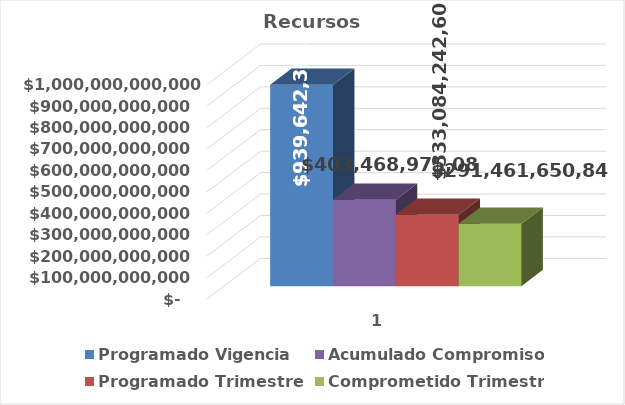
| Category | Programado Vigencia | Acumulado Compromisos | Programado Trimestre | Comprometido Trimestre |
|---|---|---|---|---|
| 0 | 939642391498 | 403468975081.07 | 333084242601 | 291461650849 |